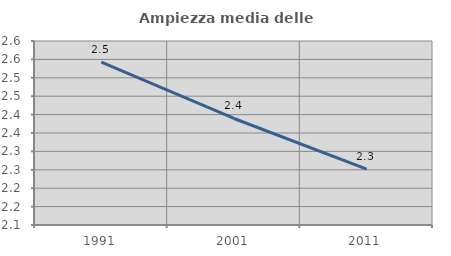
| Category | Ampiezza media delle famiglie |
|---|---|
| 1991.0 | 2.542 |
| 2001.0 | 2.389 |
| 2011.0 | 2.252 |